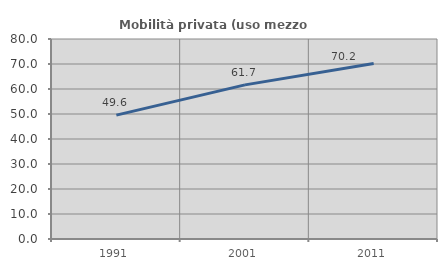
| Category | Mobilità privata (uso mezzo privato) |
|---|---|
| 1991.0 | 49.563 |
| 2001.0 | 61.656 |
| 2011.0 | 70.175 |